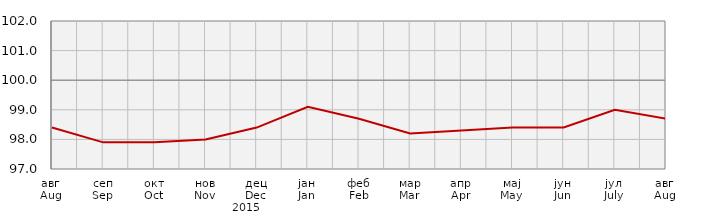
| Category | Индекси потрошачких цијена
Consumer price indices |
|---|---|
| авг
Aug | 98.4 |
| сеп
Sep | 97.9 |
| окт
Oct | 97.9 |
| нов
Nov | 98 |
| дец
Dec | 98.4 |
| јан
Jan | 99.1 |
| феб
Feb | 98.7 |
| мар
Mar | 98.2 |
| апр
Apr | 98.3 |
| мај
May | 98.4 |
| јун
Jun | 98.4 |
| јул
July | 99 |
| авг
Aug | 98.7 |